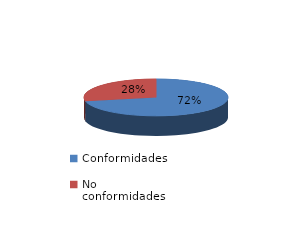
| Category | Series 0 |
|---|---|
| Conformidades | 4680 |
| No conformidades | 1852 |